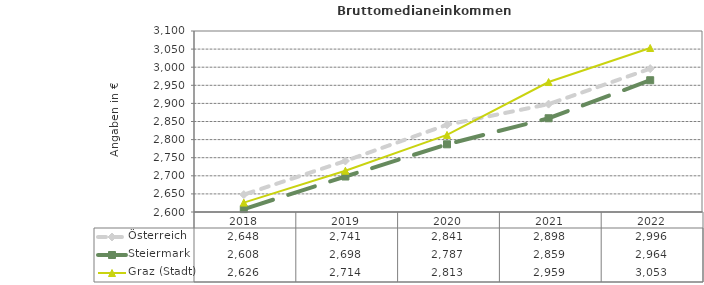
| Category | Österreich | Steiermark | Graz (Stadt) |
|---|---|---|---|
| 2022.0 | 2996 | 2964 | 3053 |
| 2021.0 | 2898 | 2859 | 2959 |
| 2020.0 | 2841 | 2787 | 2813 |
| 2019.0 | 2741 | 2698 | 2714 |
| 2018.0 | 2648 | 2608 | 2626 |